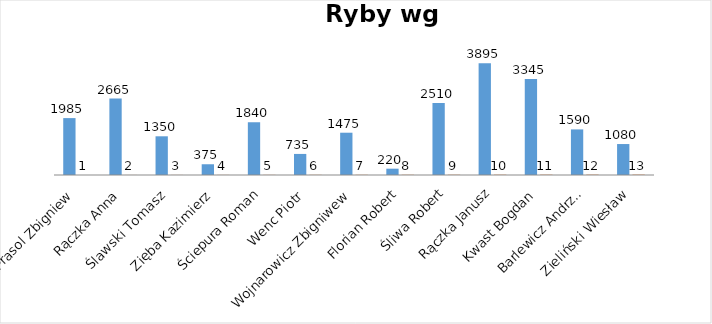
| Category | Series 0 | Series 1 |
|---|---|---|
| Prasol Zbigniew | 1985 | 1 |
| Rączka Anna | 2665 | 2 |
| Ślawski Tomasz | 1350 | 3 |
| Zięba Kazimierz | 375 | 4 |
| Ściepura Roman | 1840 | 5 |
| Wenc Piotr | 735 | 6 |
| Wojnarowicz Zbigniwew | 1475 | 7 |
| Florian Robert | 220 | 8 |
| Śliwa Robert | 2510 | 9 |
| Rączka Janusz | 3895 | 10 |
| Kwast Bogdan | 3345 | 11 |
| Barlewicz Andrzej | 1590 | 12 |
| Zieliński Wiesław | 1080 | 13 |